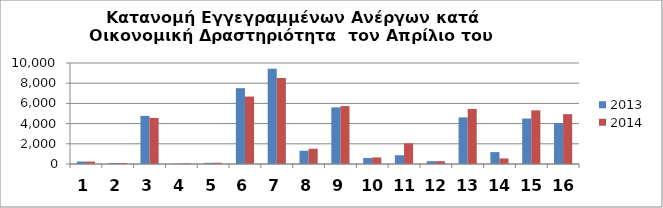
| Category | 2013 | 2014 |
|---|---|---|
| 0 | 244 | 238 |
| 1 | 99 | 95 |
| 2 | 4763 | 4564 |
| 3 | 29 | 59 |
| 4 | 115 | 124 |
| 5 | 7506 | 6677 |
| 6 | 9431 | 8513 |
| 7 | 1315 | 1515 |
| 8 | 5606 | 5735 |
| 9 | 599 | 650 |
| 10 | 868 | 2051 |
| 11 | 279 | 283 |
| 12 | 4615 | 5456 |
| 13 | 1178 | 550 |
| 14 | 4501 | 5314 |
| 15 | 4053 | 4934 |